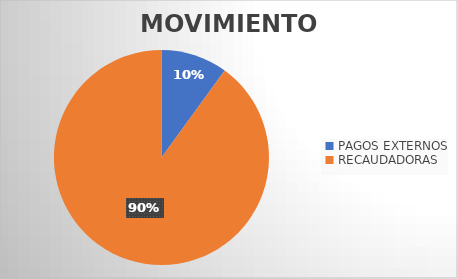
| Category | MOVIMIENTOS |
|---|---|
| PAGOS EXTERNOS | 6396 |
| RECAUDADORAS | 57534 |